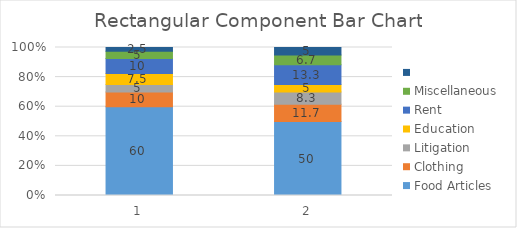
| Category | Food Articles  | Clothing | Litigation | Education | Rent  | Miscellaneous | Series 6 |
|---|---|---|---|---|---|---|---|
| 0 | 60 | 10 | 5 | 7.5 | 10 | 5 | 2.5 |
| 1 | 50 | 11.7 | 8.3 | 5 | 13.3 | 6.7 | 5 |